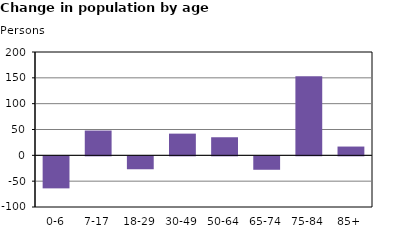
| Category | Series 2 |
|---|---|
| 0-6 | -62 |
| 7-17 | 48 |
| 18-29 | -25 |
| 30-49 | 42 |
| 50-64 | 35 |
| 65-74 | -26 |
| 75-84 | 153 |
| 85+ | 17 |